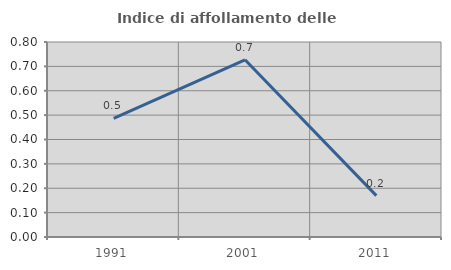
| Category | Indice di affollamento delle abitazioni  |
|---|---|
| 1991.0 | 0.486 |
| 2001.0 | 0.727 |
| 2011.0 | 0.17 |